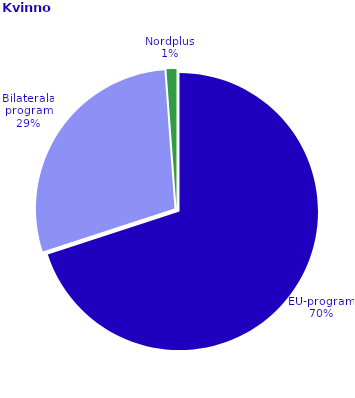
| Category | Series 0 |
|---|---|
| EU-program | 5139 |
| Bilaterala program | 2119 |
| Nordplus | 85 |